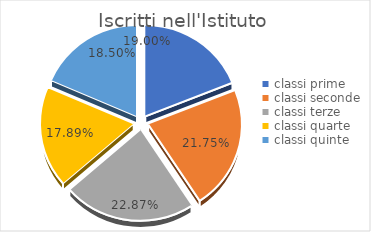
| Category | Series 0 |
|---|---|
| classi prime | 0.19 |
| classi seconde | 0.217 |
| classi terze | 0.229 |
| classi quarte | 0.179 |
| classi quinte | 0.185 |